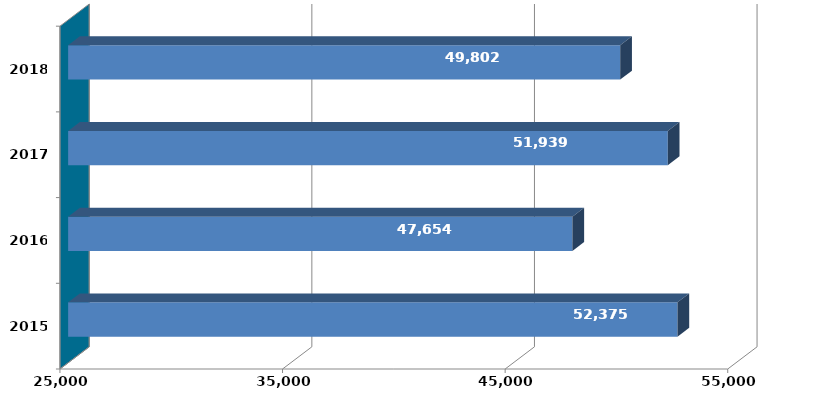
| Category | Column2 |
|---|---|
| 2015 | 52374555 |
| 2016 | 47653822 |
| 2017 | 51938940 |
| 2018 | 49801606 |